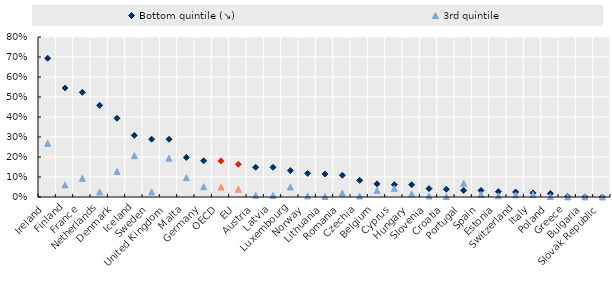
| Category | Bottom quintile (↘) | 3rd quintile |
|---|---|---|
| Ireland | 0.694 | 0.268 |
| Finland | 0.545 | 0.061 |
| France | 0.523 | 0.093 |
| Netherlands | 0.458 | 0.026 |
| Denmark | 0.394 | 0.128 |
| Iceland | 0.308 | 0.207 |
| Sweden | 0.289 | 0.025 |
| United Kingdom | 0.289 | 0.194 |
| Malta | 0.198 | 0.096 |
| Germany | 0.181 | 0.051 |
| OECD | 0.181 | 0.049 |
| EU | 0.164 | 0.039 |
| Austria | 0.149 | 0.009 |
| Latvia | 0.149 | 0.007 |
| Luxembourg | 0.132 | 0.05 |
| Norway | 0.118 | 0.005 |
| Lithuania | 0.115 | 0.003 |
| Romania | 0.109 | 0.019 |
| Czechia | 0.083 | 0.005 |
| Belgium | 0.066 | 0.034 |
| Cyprus | 0.062 | 0.043 |
| Hungary | 0.061 | 0.016 |
| Slovenia | 0.042 | 0.005 |
| Croatia | 0.039 | 0.002 |
| Portugal | 0.033 | 0.069 |
| Spain | 0.033 | 0.013 |
| Estonia | 0.027 | 0.006 |
| Switzerland | 0.025 | 0.01 |
| Italy | 0.02 | 0.013 |
| Poland | 0.017 | 0.002 |
| Greece | 0.002 | 0.001 |
| Bulgaria | 0.001 | 0.001 |
| Slovak Republic | 0 | 0 |